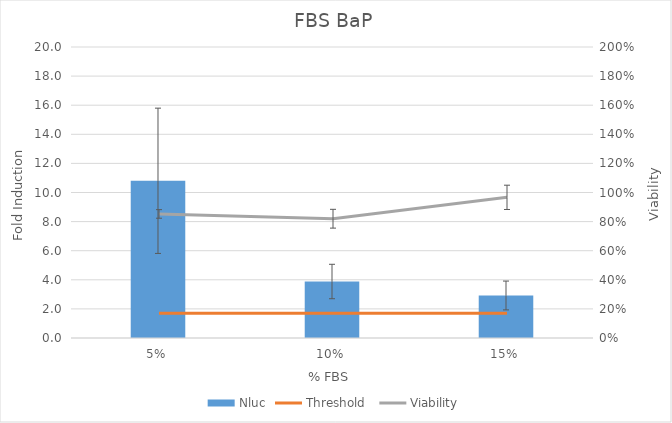
| Category | Nluc |
|---|---|
| 0.05 | 10.805 |
| 0.1 | 3.882 |
| 0.15 | 2.922 |